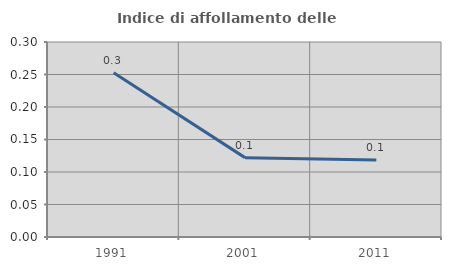
| Category | Indice di affollamento delle abitazioni  |
|---|---|
| 1991.0 | 0.253 |
| 2001.0 | 0.122 |
| 2011.0 | 0.118 |